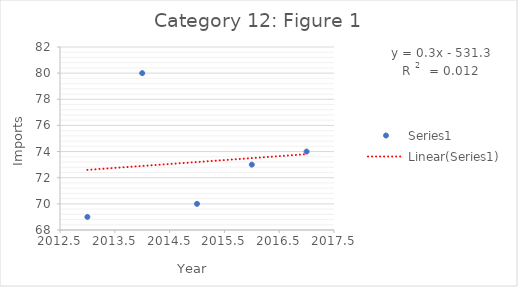
| Category | Series 0 |
|---|---|
| 2013.0 | 69 |
| 2014.0 | 80 |
| 2015.0 | 70 |
| 2016.0 | 73 |
| 2017.0 | 74 |